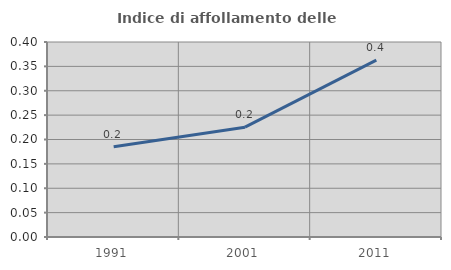
| Category | Indice di affollamento delle abitazioni  |
|---|---|
| 1991.0 | 0.185 |
| 2001.0 | 0.225 |
| 2011.0 | 0.363 |